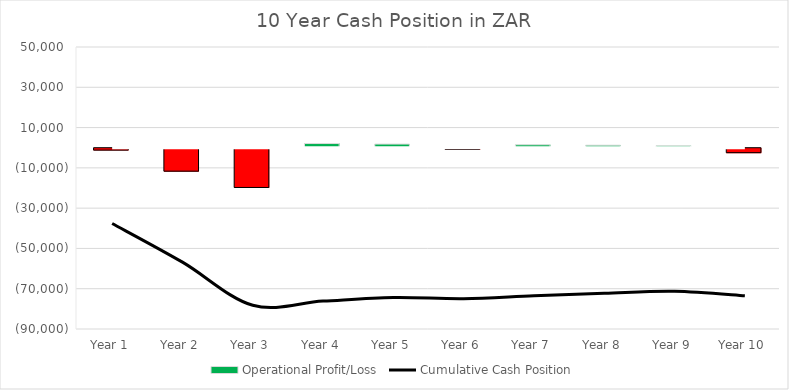
| Category | Operational Profit/Loss |
|---|---|
| 0 | -941.737 |
| 1 | -11396.134 |
| 2 | -19489.688 |
| 3 | 2071.582 |
| 4 | 1802.74 |
| 5 | -579.176 |
| 6 | 1444.435 |
| 7 | 1243.471 |
| 8 | 954.4 |
| 9 | -2215.994 |